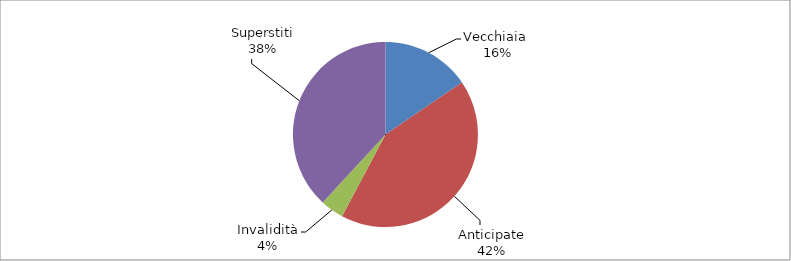
| Category | Series 0 |
|---|---|
| Vecchiaia  | 4500 |
| Anticipate | 12291 |
| Invalidità | 1192 |
| Superstiti | 11076 |